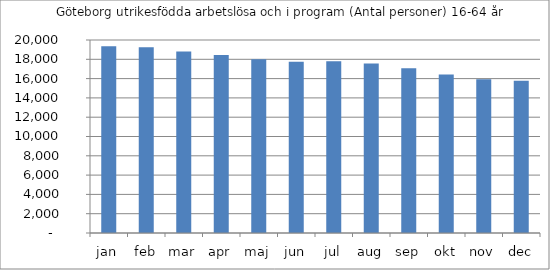
| Category | Göteborg |
|---|---|
| jan | 19349 |
| feb | 19249 |
| mar | 18810 |
| apr | 18443 |
| maj | 18011 |
| jun | 17751 |
| jul | 17807 |
| aug | 17553 |
| sep | 17083 |
| okt | 16423 |
| nov | 15931 |
| dec | 15771 |